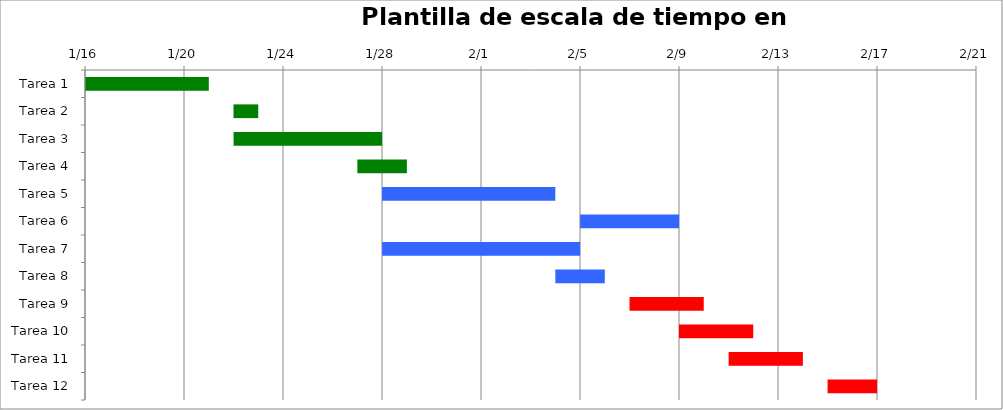
| Category | Fecha de inicio | Duración (días) |
|---|---|---|
| Tarea 1 | 2015-01-16 | 5 |
| Tarea 2 | 2015-01-22 | 1 |
| Tarea 3 | 2015-01-22 | 6 |
| Tarea 4 | 2015-01-27 | 2 |
| Tarea 5 | 2015-01-28 | 7 |
| Tarea 6 | 2015-02-05 | 4 |
| Tarea 7 | 2015-01-28 | 8 |
| Tarea 8 | 2015-02-04 | 2 |
| Tarea 9 | 2015-02-07 | 3 |
| Tarea 10 | 2015-02-09 | 3 |
| Tarea 11 | 2015-02-11 | 3 |
| Tarea 12 | 2015-02-15 | 2 |